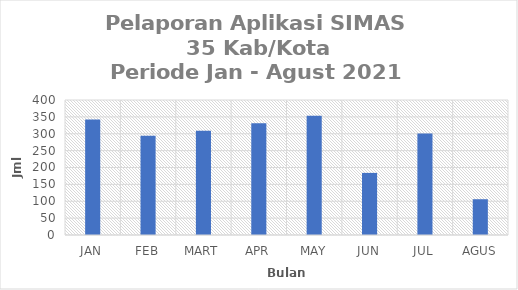
| Category | Series 0 |
|---|---|
| JAN | 342 |
| FEB | 294 |
| MART | 309 |
| APR | 331 |
| MAY | 353 |
| JUN | 184 |
| JUL | 301 |
| AGUS | 106 |